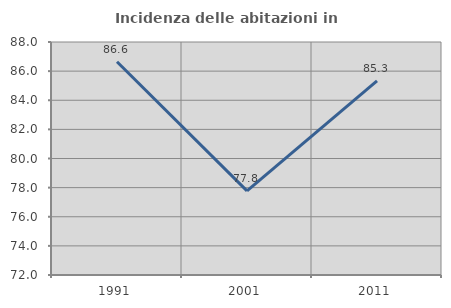
| Category | Incidenza delle abitazioni in proprietà  |
|---|---|
| 1991.0 | 86.64 |
| 2001.0 | 77.778 |
| 2011.0 | 85.333 |